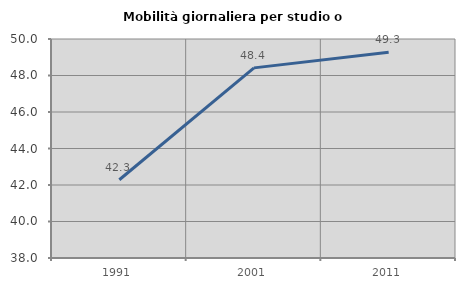
| Category | Mobilità giornaliera per studio o lavoro |
|---|---|
| 1991.0 | 42.287 |
| 2001.0 | 48.418 |
| 2011.0 | 49.276 |